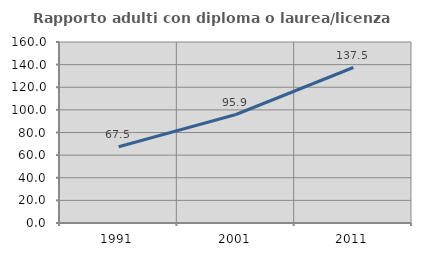
| Category | Rapporto adulti con diploma o laurea/licenza media  |
|---|---|
| 1991.0 | 67.466 |
| 2001.0 | 95.903 |
| 2011.0 | 137.454 |